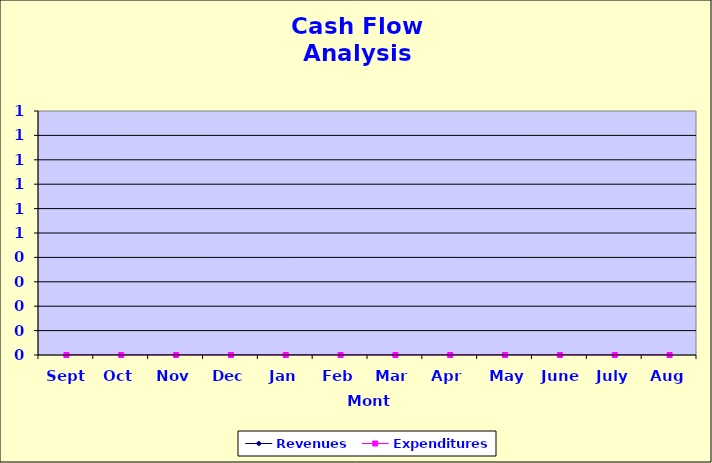
| Category | Revenues | Expenditures |
|---|---|---|
| Sept | 0 | 0 |
| Oct | 0 | 0 |
| Nov | 0 | 0 |
| Dec | 0 | 0 |
| Jan | 0 | 0 |
| Feb | 0 | 0 |
| Mar | 0 | 0 |
| Apr | 0 | 0 |
| May | 0 | 0 |
| June | 0 | 0 |
| July | 0 | 0 |
| Aug | 0 | 0 |